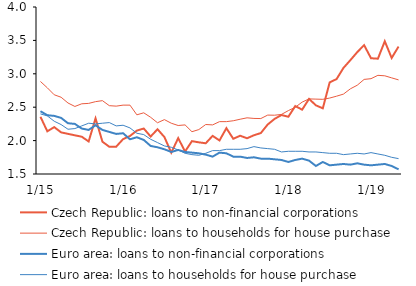
| Category | Czech Republic: loans to non-financial corporations | Czech Republic: loans to households for house purchase | Euro area: loans to non-financial corporations | Euro area: loans to households for house purchase |
|---|---|---|---|---|
|  1/15 | 2.357 | 2.885 | 2.44 | 2.4 |
| 2 | 2.139 | 2.79 | 2.38 | 2.37 |
| 3 | 2.202 | 2.686 | 2.37 | 2.29 |
| 4 | 2.123 | 2.649 | 2.34 | 2.24 |
| 5 | 2.101 | 2.563 | 2.26 | 2.17 |
| 6 | 2.079 | 2.511 | 2.25 | 2.18 |
| 7 | 2.058 | 2.551 | 2.18 | 2.22 |
| 8 | 1.987 | 2.557 | 2.16 | 2.26 |
| 9 | 2.333 | 2.583 | 2.23 | 2.25 |
| 10 | 1.984 | 2.598 | 2.16 | 2.26 |
| 11 | 1.907 | 2.523 | 2.13 | 2.27 |
| 12 | 1.909 | 2.516 | 2.1 | 2.22 |
|  1/16 | 2.022 | 2.531 | 2.11 | 2.23 |
| 2 | 2.069 | 2.531 | 2.02 | 2.19 |
| 3 | 2.15 | 2.386 | 2.05 | 2.11 |
| 4 | 2.181 | 2.416 | 2.01 | 2.09 |
| 5 | 2.061 | 2.349 | 1.92 | 2.02 |
| 6 | 2.17 | 2.267 | 1.9 | 1.97 |
| 7 | 2.053 | 2.314 | 1.87 | 1.92 |
| 8 | 1.819 | 2.26 | 1.83 | 1.9 |
| 9 | 2.037 | 2.226 | 1.86 | 1.86 |
| 10 | 1.837 | 2.235 | 1.83 | 1.81 |
| 11 | 1.992 | 2.133 | 1.82 | 1.79 |
| 12 | 1.974 | 2.165 | 1.81 | 1.78 |
|  1/17 | 1.96 | 2.241 | 1.79 | 1.81 |
| 2 | 2.071 | 2.235 | 1.76 | 1.85 |
| 3 | 2.002 | 2.284 | 1.82 | 1.85 |
| 4 | 2.186 | 2.284 | 1.81 | 1.87 |
| 5 | 2.027 | 2.297 | 1.76 | 1.87 |
| 6 | 2.073 | 2.32 | 1.76 | 1.87 |
| 7 | 2.035 | 2.341 | 1.74 | 1.88 |
| 8 | 2.08 | 2.332 | 1.75 | 1.91 |
| 9 | 2.113 | 2.33 | 1.73 | 1.89 |
| 10 | 2.241 | 2.382 | 1.73 | 1.88 |
| 11 | 2.325 | 2.38 | 1.72 | 1.87 |
| 12 | 2.383 | 2.392 | 1.71 | 1.83 |
|  1/18 | 2.357 | 2.449 | 1.68 | 1.84 |
| 2 | 2.517 | 2.499 | 1.71 | 1.84 |
| 3 | 2.463 | 2.576 | 1.73 | 1.84 |
| 4 | 2.624 | 2.624 | 1.7 | 1.83 |
| 5 | 2.528 | 2.621 | 1.62 | 1.83 |
| 6 | 2.483 | 2.618 | 1.68 | 1.82 |
| 7 | 2.872 | 2.637 | 1.63 | 1.81 |
| 8 | 2.921 | 2.665 | 1.64 | 1.81 |
| 9 | 3.088 | 2.696 | 1.65 | 1.79 |
| 10 | 3.204 | 2.775 | 1.64 | 1.8 |
| 11 | 3.324 | 2.829 | 1.66 | 1.81 |
| 12 | 3.429 | 2.916 | 1.64 | 1.8 |
|  1/19 | 3.233 | 2.927 | 1.63 | 1.82 |
| 2 | 3.226 | 2.977 | 1.64 | 1.8 |
| 3 | 3.487 | 2.97 | 1.65 | 1.78 |
| 4 | 3.237 | 2.939 | 1.62 | 1.75 |
| 5 | 3.408 | 2.909 | 1.57 | 1.73 |